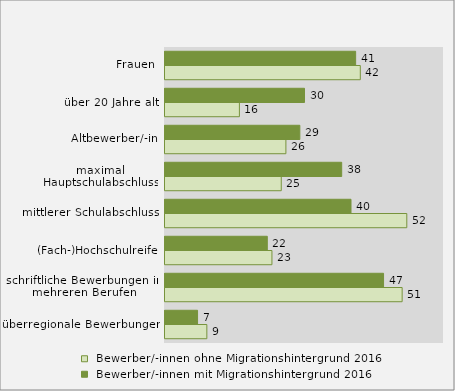
| Category |  Bewerber/-innen ohne Migrationshintergrund 2016 |  Bewerber/-innen mit Migrationshintergrund 2016 |
|---|---|---|
| überregionale Bewerbungen | 9 | 7 |
| schriftliche Bewerbungen in mehreren Berufen | 51 | 47 |
| (Fach-)Hochschulreife | 23 | 22 |
| mittlerer Schulabschluss | 52 | 40 |
| maximal Hauptschulabschluss | 25 | 38 |
| Altbewerber/-in | 26 | 29 |
| über 20 Jahre alt | 16 | 30 |
| Frauen | 42 | 41 |